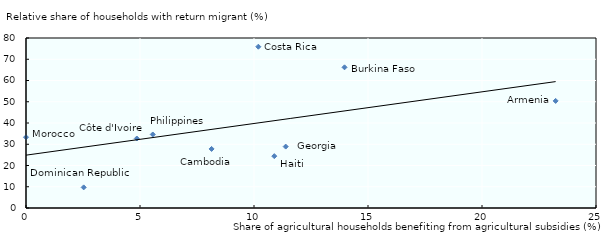
| Category | Series 0 |
|---|---|
| 23.23 | 50.4 |
| 13.97 | 66.2 |
| 8.14 | 27.8 |
| 10.19 | 75.9 |
| 4.86 | 32.7 |
| 2.53 | 9.7 |
| 11.39 | 28.9 |
| 10.89 | 24.4 |
| 0.0 | 33.3 |
| 5.56 | 34.6 |